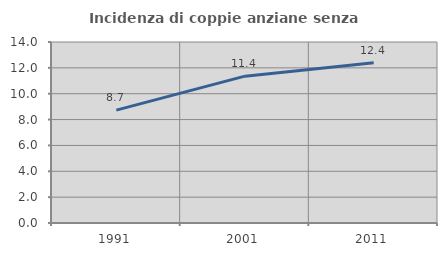
| Category | Incidenza di coppie anziane senza figli  |
|---|---|
| 1991.0 | 8.727 |
| 2001.0 | 11.357 |
| 2011.0 | 12.395 |